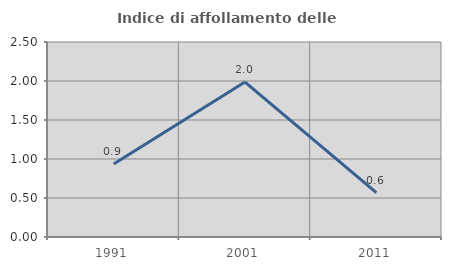
| Category | Indice di affollamento delle abitazioni  |
|---|---|
| 1991.0 | 0.935 |
| 2001.0 | 1.987 |
| 2011.0 | 0.569 |